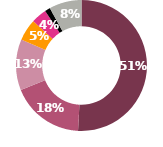
| Category | Series 0 |
|---|---|
| 0 | 183.1 |
| 1 | 65 |
| 2 | 45.3 |
| 3 | 19.3 |
| 4 | 13.7 |
| 5 | 4.8 |
| 6 | 28.9 |